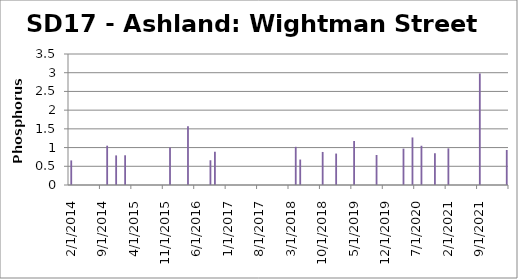
| Category | Phosphorus (mg/L) |
|---|---|
| 2/12/14 | 0.657 |
| 10/8/14 | 1.05 |
| 12/11/14 | 0.791 |
| 2/2/15 | 0.794 |
| 12/10/15 | 1 |
| 4/14/16 | 1.57 |
| 9/7/16 | 0.661 |
| 10/14/16 | 0.889 |
| 4/12/18 | 1.02 |
| 5/16/18 | 0.68 |
| 10/24/18 | 0.883 |
| 1/17/19 | 0.84 |
| 5/16/19 | 1.177 |
| 10/17/19 | 0.802 |
| 4/22/20 | 0.972 |
| 6/23/20 | 1.27 |
| 8/20/20 | 1.048 |
| 11/18/20 | 0.845 |
| 2/19/21 | 0.979 |
| 9/14/21 | 2.981 |
| 3/3/22 | 0.936 |